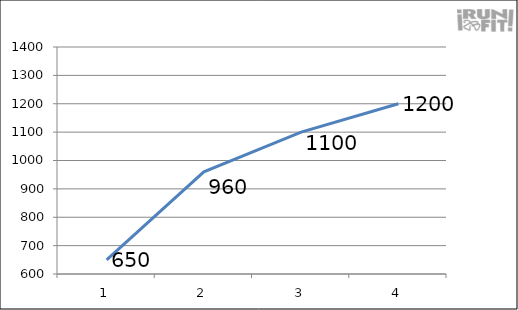
| Category | Series 0 |
|---|---|
| 0 | 650 |
| 1 | 960 |
| 2 | 1100 |
| 3 | 1200 |